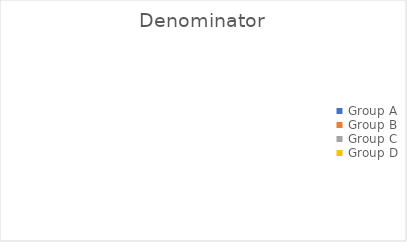
| Category |  Denominator  |
|---|---|
| Group A | 0 |
| Group B | 0 |
| Group C | 0 |
| Group D | 0 |